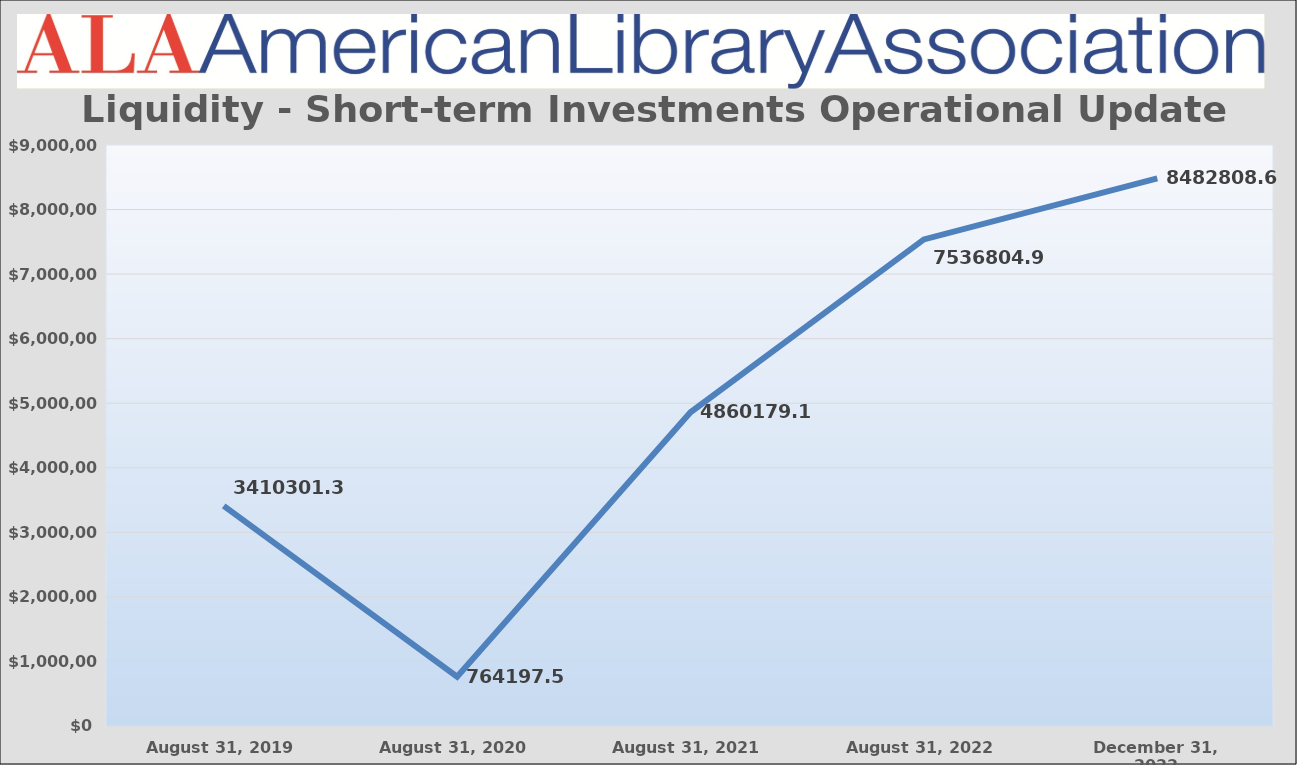
| Category | Series 0 |
|---|---|
| August 31, 2019 | 3410301.38 |
| August 31, 2020 | 764197.52 |
| August 31, 2021 | 4860179.15 |
| August 31, 2022 | 7536804.92 |
| December 31, 2022 | 8482808.64 |